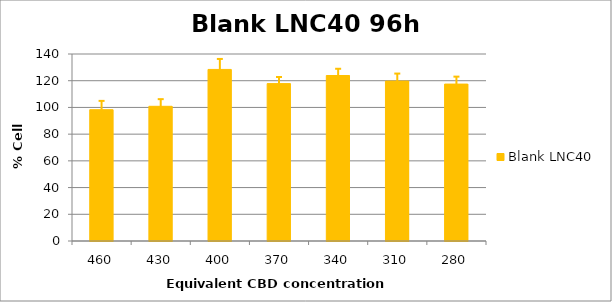
| Category | Blank LNC40 |
|---|---|
| 460.0 | 98.303 |
| 430.0 | 100.838 |
| 400.0 | 128.452 |
| 370.0 | 117.826 |
| 340.0 | 123.902 |
| 310.0 | 119.715 |
| 280.0 | 117.476 |